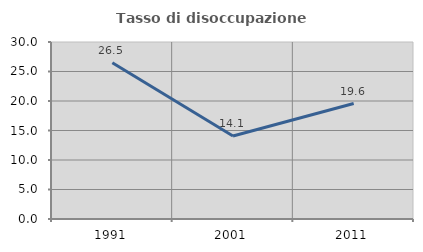
| Category | Tasso di disoccupazione giovanile  |
|---|---|
| 1991.0 | 26.471 |
| 2001.0 | 14.062 |
| 2011.0 | 19.565 |